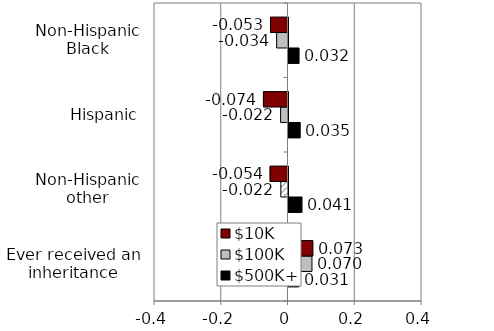
| Category | $500K+ | $100K | $10K |
|---|---|---|---|
| Ever received an inheritance | 0.031 | 0.07 | 0.073 |
| Non-Hispanic other | 0.04 | -0.022 | -0.054 |
| Hispanic | 0.035 | -0.022 | -0.074 |
| Non-Hispanic Black | 0.032 | -0.034 | -0.052 |